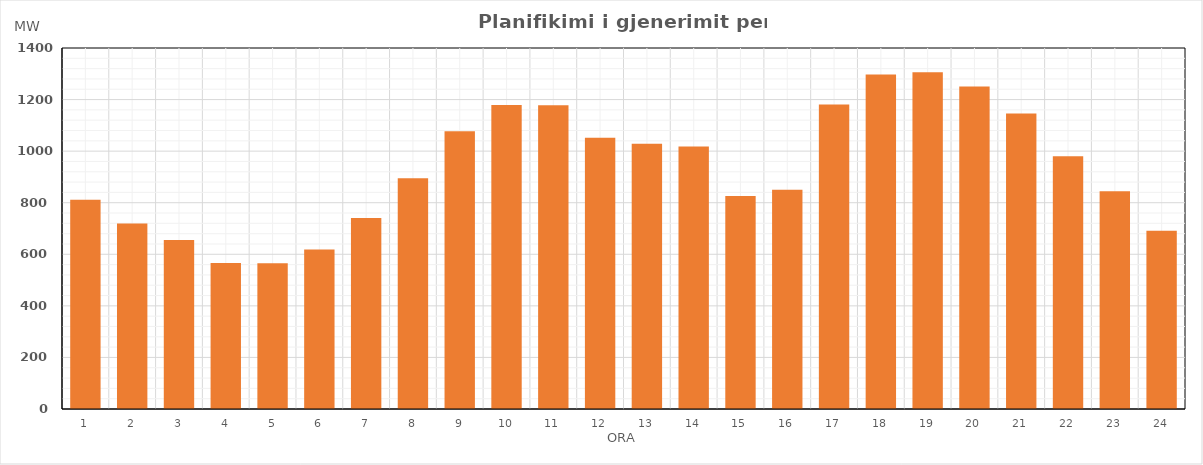
| Category | Max (MW) |
|---|---|
| 0 | 811.67 |
| 1 | 719.75 |
| 2 | 655.14 |
| 3 | 566.44 |
| 4 | 565.33 |
| 5 | 618.65 |
| 6 | 740.94 |
| 7 | 894.87 |
| 8 | 1077.46 |
| 9 | 1178.69 |
| 10 | 1177.98 |
| 11 | 1052.37 |
| 12 | 1029.06 |
| 13 | 1018.26 |
| 14 | 825.63 |
| 15 | 850.46 |
| 16 | 1180.7 |
| 17 | 1297.32 |
| 18 | 1306.12 |
| 19 | 1251.06 |
| 20 | 1146.35 |
| 21 | 980.27 |
| 22 | 844.88 |
| 23 | 691.6 |